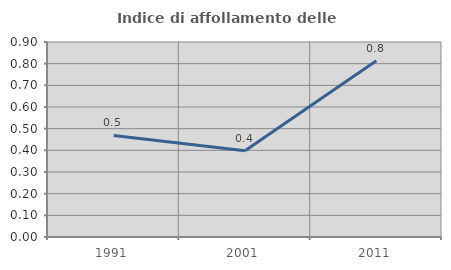
| Category | Indice di affollamento delle abitazioni  |
|---|---|
| 1991.0 | 0.469 |
| 2001.0 | 0.398 |
| 2011.0 | 0.814 |